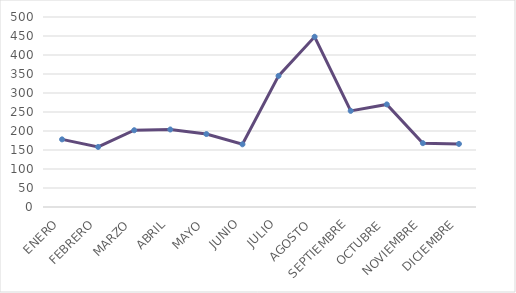
| Category | Series 0 |
|---|---|
| ENERO | 178 |
| FEBRERO | 158 |
| MARZO | 202 |
| ABRIL | 204 |
| MAYO | 192 |
| JUNIO | 165 |
| JULIO | 345 |
| AGOSTO | 448 |
| SEPTIEMBRE | 253 |
| OCTUBRE | 270 |
| NOVIEMBRE | 168 |
| DICIEMBRE | 166 |